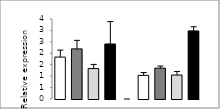
| Category | Series 0 |
|---|---|
|  - | 1.834 |
| HC | 2.192 |